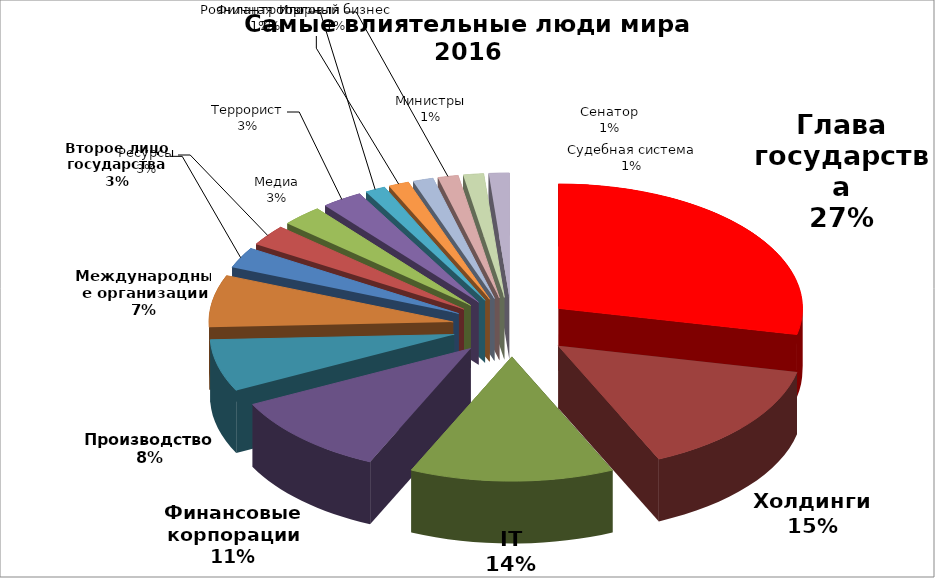
| Category | Series 0 |
|---|---|
| Глава государства | 21 |
| Холдинги | 11 |
| IT | 10 |
| Финансовые корпорации | 8 |
| Производство | 5 |
| Международные организации | 5 |
| Второе лицо государства | 2 |
| Ресурсы | 2 |
| Медиа | 2 |
| Террорист | 2 |
| Филантропы | 1 |
| Игорный бизнес | 1 |
| Министры | 1 |
| Розничная торговля | 1 |
| Сенатор | 1 |
| Судебная система | 1 |